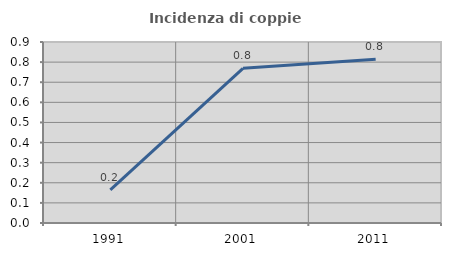
| Category | Incidenza di coppie miste |
|---|---|
| 1991.0 | 0.165 |
| 2001.0 | 0.769 |
| 2011.0 | 0.814 |